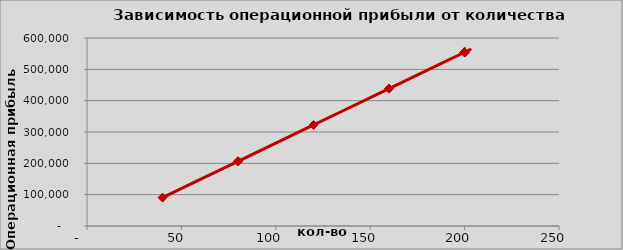
| Category | Операционная прибыль |
|---|---|
| 40.0 | 90500 |
| 80.0 | 206500 |
| 80.0 | 206500 |
| 120.0 | 322500 |
| 160.0 | 438500 |
| 160.0 | 438500 |
| 200.0 | 554500 |
| 200.0 | 554500 |
| 200.0 | 554500 |
| 200.0 | 554500 |
| 200.0 | 554500 |
| 200.0 | 554500 |